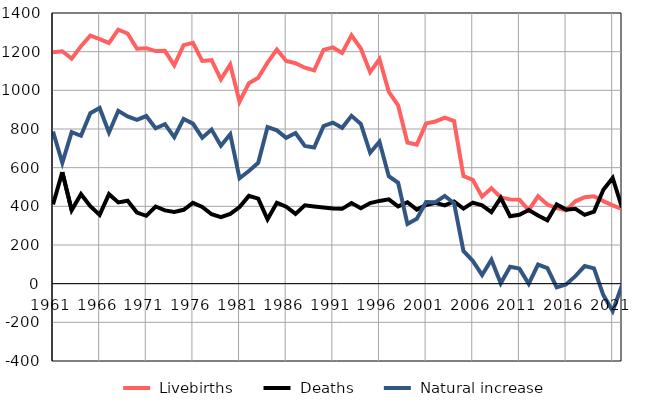
| Category |  Livebirths |  Deaths |  Natural increase |
|---|---|---|---|
| 1961.0 | 1197 | 410 | 787 |
| 1962.0 | 1202 | 577 | 625 |
| 1963.0 | 1164 | 380 | 784 |
| 1964.0 | 1228 | 463 | 765 |
| 1965.0 | 1283 | 401 | 882 |
| 1966.0 | 1265 | 356 | 909 |
| 1967.0 | 1245 | 463 | 782 |
| 1968.0 | 1314 | 420 | 894 |
| 1969.0 | 1294 | 429 | 865 |
| 1970.0 | 1215 | 368 | 847 |
| 1971.0 | 1218 | 351 | 867 |
| 1972.0 | 1203 | 399 | 804 |
| 1973.0 | 1204 | 379 | 825 |
| 1974.0 | 1129 | 371 | 758 |
| 1975.0 | 1234 | 382 | 852 |
| 1976.0 | 1246 | 418 | 828 |
| 1977.0 | 1152 | 397 | 755 |
| 1978.0 | 1156 | 359 | 797 |
| 1979.0 | 1057 | 344 | 713 |
| 1980.0 | 1134 | 361 | 773 |
| 1981.0 | 941 | 396 | 545 |
| 1982.0 | 1037 | 454 | 583 |
| 1983.0 | 1065 | 440 | 625 |
| 1984.0 | 1143 | 333 | 810 |
| 1985.0 | 1211 | 418 | 793 |
| 1986.0 | 1152 | 398 | 754 |
| 1987.0 | 1140 | 361 | 779 |
| 1988.0 | 1117 | 405 | 712 |
| 1989.0 | 1103 | 399 | 704 |
| 1990.0 | 1209 | 394 | 815 |
| 1991.0 | 1222 | 389 | 833 |
| 1992.0 | 1193 | 387 | 806 |
| 1993.0 | 1285 | 417 | 868 |
| 1994.0 | 1216 | 390 | 826 |
| 1995.0 | 1094 | 417 | 677 |
| 1996.0 | 1162 | 428 | 734 |
| 1997.0 | 992 | 436 | 556 |
| 1998.0 | 922 | 400 | 522 |
| 1999.0 | 730 | 421 | 309 |
| 2000.0 | 719 | 383 | 336 |
| 2001.0 | 829 | 407 | 422 |
| 2002.0 | 839 | 418 | 421 |
| 2003.0 | 859 | 405 | 454 |
| 2004.0 | 841 | 425 | 416 |
| 2005.0 | 557 | 388 | 169 |
| 2006.0 | 537 | 419 | 118 |
| 2007.0 | 450 | 405 | 45 |
| 2008.0 | 494 | 370 | 124 |
| 2009.0 | 446 | 444 | 2 |
| 2010.0 | 436 | 349 | 87 |
| 2011.0 | 434 | 356 | 78 |
| 2012.0 | 380 | 381 | -1 |
| 2013.0 | 452 | 353 | 99 |
| 2014.0 | 409 | 328 | 81 |
| 2015.0 | 391 | 410 | -19 |
| 2016.0 | 379 | 383 | -4 |
| 2017.0 | 426 | 387 | 39 |
| 2018.0 | 447 | 356 | 91 |
| 2019.0 | 452 | 373 | 79 |
| 2020.0 | 427 | 486 | -59 |
| 2021.0 | 405 | 547 | -142 |
| 2022.0 | 386 | 394 | -8 |